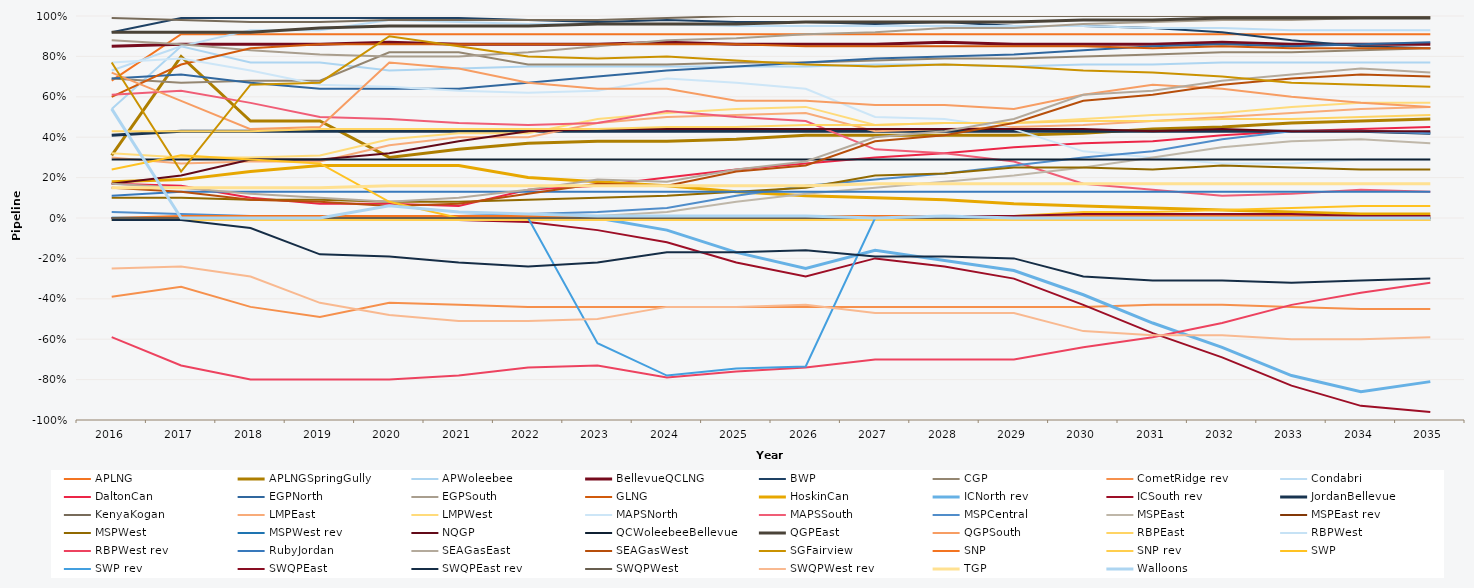
| Category | APLNG | APLNGSpringGully | APWoleebee | BellevueQCLNG | BWP | CGP | CometRidge rev | Condabri | DaltonCan | EGPNorth | EGPSouth | GLNG | HoskinCan | ICNorth rev | ICSouth rev | JordanBellevue | KenyaKogan | LMPEast | LMPWest | MAPSNorth | MAPSSouth | MSPCentral | MSPEast | MSPEast rev | MSPWest | MSPWest rev | NQGP | QCWoleebeeBellevue | QGPEast | QGPSouth | RBPEast | RBPWest | RBPWest rev | RubyJordan | SEAGasEast | SEAGasWest | SGFairview | SNP | SNP rev | SWP | SWP rev | SWQPEast | SWQPEast rev | SWQPWest | SWQPWest rev | TGP | Walloons |
|---|---|---|---|---|---|---|---|---|---|---|---|---|---|---|---|---|---|---|---|---|---|---|---|---|---|---|---|---|---|---|---|---|---|---|---|---|---|---|---|---|---|---|---|---|---|---|---|
| 2016.0 | 0.68 | 0.31 | 0.54 | 0.85 | 0.92 | 0.69 | -0.39 | 0.73 | 0.17 | 0.69 | 0.88 | 0.6 | 0.18 | 0 | 0 | 0.41 | 0.99 | 0.3 | 0.32 | 0.77 | 0.61 | 0.03 | 0 | 0 | 0.1 | 0 | 0.17 | 0.29 | 0.92 | 0.72 | 0.43 | 0 | -0.59 | 0.11 | 0.17 | 0.15 | 0.77 | 0 | -0.01 | 0.24 | 0 | 0 | -0.01 | 0 | -0.25 | 0.15 | 0.54 |
| 2017.0 | 0.91 | 0.8 | 0.85 | 0.86 | 0.99 | 0.67 | -0.34 | 0.85 | 0.16 | 0.71 | 0.86 | 0.76 | 0.19 | 0 | -0.01 | 0.43 | 0.98 | 0.27 | 0.3 | 0.79 | 0.63 | 0.02 | 0 | 0 | 0.1 | 0 | 0.21 | 0.29 | 0.92 | 0.58 | 0.43 | 0 | -0.73 | 0.13 | 0.15 | 0.13 | 0.23 | 0.01 | -0.01 | 0.31 | 0 | 0 | -0.01 | 0 | -0.24 | 0.15 | 0 |
| 2018.0 | 0.91 | 0.48 | 0.77 | 0.86 | 0.99 | 0.68 | -0.44 | 0.93 | 0.1 | 0.67 | 0.83 | 0.84 | 0.23 | 0 | -0.01 | 0.43 | 0.97 | 0.28 | 0.3 | 0.73 | 0.57 | 0.01 | 0 | 0 | 0.09 | 0 | 0.29 | 0.29 | 0.92 | 0.44 | 0.43 | 0 | -0.8 | 0.13 | 0.12 | 0.09 | 0.66 | 0.01 | -0.01 | 0.29 | 0 | 0 | -0.05 | 0 | -0.29 | 0.15 | 0 |
| 2019.0 | 0.91 | 0.48 | 0.77 | 0.86 | 0.99 | 0.68 | -0.49 | 0.93 | 0.07 | 0.64 | 0.81 | 0.86 | 0.26 | 0 | -0.01 | 0.43 | 0.97 | 0.28 | 0.31 | 0.66 | 0.5 | 0.01 | 0 | 0 | 0.09 | 0 | 0.29 | 0.29 | 0.94 | 0.45 | 0.44 | 0 | -0.8 | 0.13 | 0.1 | 0.08 | 0.67 | 0.01 | -0.01 | 0.27 | 0 | 0 | -0.18 | 0 | -0.42 | 0.15 | 0 |
| 2020.0 | 0.91 | 0.3 | 0.73 | 0.87 | 0.99 | 0.82 | -0.42 | 0.98 | 0.07 | 0.64 | 0.8 | 0.86 | 0.26 | 0 | -0.01 | 0.43 | 0.98 | 0.36 | 0.39 | 0.65 | 0.49 | 0.01 | 0 | 0 | 0.08 | 0 | 0.32 | 0.29 | 0.95 | 0.77 | 0.44 | 0 | -0.8 | 0.13 | 0.08 | 0.06 | 0.9 | 0.01 | -0.01 | 0.08 | 0 | 0 | -0.19 | 0 | -0.48 | 0.16 | 0.06 |
| 2021.0 | 0.91 | 0.34 | 0.74 | 0.86 | 0.99 | 0.82 | -0.43 | 0.97 | 0.06 | 0.64 | 0.8 | 0.86 | 0.26 | 0 | -0.01 | 0.43 | 0.98 | 0.4 | 0.42 | 0.63 | 0.47 | 0.01 | 0 | 0 | 0.08 | 0 | 0.38 | 0.29 | 0.95 | 0.74 | 0.44 | 0 | -0.78 | 0.13 | 0.1 | 0.07 | 0.85 | 0.01 | -0.01 | 0 | 0 | 0 | -0.22 | 0 | -0.51 | 0.16 | 0.03 |
| 2022.0 | 0.91 | 0.37 | 0.75 | 0.86 | 0.98 | 0.76 | -0.44 | 0.96 | 0.14 | 0.67 | 0.82 | 0.86 | 0.2 | 0 | -0.02 | 0.43 | 0.98 | 0.4 | 0.42 | 0.62 | 0.46 | 0.02 | 0 | 0 | 0.09 | 0 | 0.43 | 0.29 | 0.95 | 0.67 | 0.44 | 0 | -0.74 | 0.13 | 0.14 | 0.12 | 0.8 | 0.01 | -0.01 | 0 | 0 | 0 | -0.24 | 0 | -0.51 | 0.16 | 0.02 |
| 2023.0 | 0.91 | 0.38 | 0.75 | 0.86 | 0.97 | 0.76 | -0.44 | 0.96 | 0.16 | 0.7 | 0.85 | 0.86 | 0.18 | 0 | -0.06 | 0.43 | 0.98 | 0.47 | 0.49 | 0.63 | 0.47 | 0.03 | 0.01 | 0 | 0.1 | 0 | 0.44 | 0.29 | 0.96 | 0.64 | 0.44 | 0 | -0.73 | 0.13 | 0.19 | 0.17 | 0.79 | 0.01 | -0.01 | 0 | -0.62 | 0 | -0.22 | 0 | -0.5 | 0.16 | 0.01 |
| 2024.0 | 0.91 | 0.38 | 0.75 | 0.87 | 0.98 | 0.76 | -0.44 | 0.96 | 0.2 | 0.73 | 0.88 | 0.86 | 0.16 | -0.06 | -0.12 | 0.43 | 0.99 | 0.5 | 0.52 | 0.69 | 0.53 | 0.05 | 0.03 | 0 | 0.11 | 0 | 0.44 | 0.29 | 0.96 | 0.64 | 0.45 | 0 | -0.79 | 0.13 | 0.18 | 0.16 | 0.8 | 0.01 | -0.01 | 0 | -0.78 | 0 | -0.17 | 0 | -0.44 | 0.16 | 0.01 |
| 2025.0 | 0.91 | 0.39 | 0.75 | 0.86 | 0.97 | 0.77 | -0.44 | 0.95 | 0.24 | 0.75 | 0.89 | 0.86 | 0.13 | -0.17 | -0.22 | 0.43 | 1 | 0.51 | 0.54 | 0.67 | 0.5 | 0.11 | 0.08 | 0 | 0.13 | 0 | 0.44 | 0.29 | 0.96 | 0.58 | 0.45 | 0 | -0.76 | 0.13 | 0.24 | 0.23 | 0.78 | 0.01 | -0.01 | 0 | -0.745 | 0 | -0.17 | 0 | -0.44 | 0.16 | 0.01 |
| 2026.0 | 0.91 | 0.41 | 0.75 | 0.86 | 0.97 | 0.77 | -0.44 | 0.95 | 0.27 | 0.77 | 0.91 | 0.85 | 0.11 | -0.25 | -0.29 | 0.43 | 1 | 0.52 | 0.55 | 0.64 | 0.48 | 0.16 | 0.12 | 0 | 0.15 | 0 | 0.44 | 0.29 | 0.97 | 0.58 | 0.46 | 0 | -0.74 | 0.13 | 0.28 | 0.26 | 0.76 | 0.01 | -0.01 | 0 | -0.735 | 0 | -0.16 | 0 | -0.43 | 0.16 | 0.01 |
| 2027.0 | 0.91 | 0.41 | 0.76 | 0.86 | 0.96 | 0.78 | -0.44 | 0.95 | 0.3 | 0.79 | 0.92 | 0.85 | 0.1 | -0.16 | -0.2 | 0.43 | 1 | 0.43 | 0.46 | 0.5 | 0.34 | 0.19 | 0.15 | 0 | 0.21 | 0 | 0.44 | 0.29 | 0.97 | 0.56 | 0.46 | 0 | -0.7 | 0.13 | 0.4 | 0.38 | 0.75 | 0.01 | -0.01 | 0 | 0 | 0 | -0.19 | 0 | -0.47 | 0.17 | 0 |
| 2028.0 | 0.91 | 0.41 | 0.76 | 0.87 | 0.97 | 0.79 | -0.44 | 0.95 | 0.32 | 0.8 | 0.94 | 0.85 | 0.09 | -0.21 | -0.24 | 0.43 | 1 | 0.44 | 0.47 | 0.49 | 0.32 | 0.22 | 0.18 | 0 | 0.22 | 0 | 0.44 | 0.29 | 0.97 | 0.56 | 0.47 | 0 | -0.7 | 0.13 | 0.43 | 0.41 | 0.76 | 0.01 | -0.01 | 0 | 0 | 0.01 | -0.19 | 0 | -0.47 | 0.17 | 0.01 |
| 2029.0 | 0.91 | 0.41 | 0.75 | 0.86 | 0.95 | 0.79 | -0.44 | 0.95 | 0.35 | 0.81 | 0.94 | 0.85 | 0.07 | -0.26 | -0.3 | 0.43 | 1 | 0.45 | 0.47 | 0.44 | 0.28 | 0.26 | 0.21 | 0 | 0.25 | 0 | 0.44 | 0.29 | 0.97 | 0.54 | 0.47 | 0 | -0.7 | 0.13 | 0.49 | 0.47 | 0.75 | 0.01 | -0.01 | 0.01 | 0 | 0.01 | -0.2 | 0 | -0.47 | 0.17 | 0 |
| 2030.0 | 0.91 | 0.42 | 0.76 | 0.86 | 0.95 | 0.8 | -0.44 | 0.95 | 0.37 | 0.83 | 0.96 | 0.85 | 0.06 | -0.38 | -0.43 | 0.43 | 1 | 0.46 | 0.49 | 0.33 | 0.17 | 0.3 | 0.25 | 0 | 0.25 | 0 | 0.44 | 0.29 | 0.98 | 0.61 | 0.48 | 0 | -0.64 | 0.13 | 0.61 | 0.58 | 0.73 | 0.01 | -0.01 | 0.03 | 0 | 0.02 | -0.29 | 0 | -0.56 | 0.17 | 0 |
| 2031.0 | 0.91 | 0.44 | 0.76 | 0.86 | 0.94 | 0.81 | -0.43 | 0.94 | 0.38 | 0.85 | 0.97 | 0.84 | 0.05 | -0.52 | -0.57 | 0.43 | 1 | 0.48 | 0.51 | 0.3 | 0.14 | 0.33 | 0.3 | -0.01 | 0.24 | 0 | 0.43 | 0.29 | 0.98 | 0.66 | 0.48 | 0 | -0.59 | 0.13 | 0.63 | 0.61 | 0.72 | 0.01 | -0.01 | 0.03 | 0 | 0.02 | -0.31 | 0 | -0.58 | 0.17 | 0 |
| 2032.0 | 0.91 | 0.45 | 0.77 | 0.87 | 0.92 | 0.82 | -0.43 | 0.94 | 0.41 | 0.86 | 0.98 | 0.85 | 0.04 | -0.64 | -0.69 | 0.43 | 1 | 0.5 | 0.52 | 0.27 | 0.11 | 0.39 | 0.35 | -0.01 | 0.26 | 0 | 0.44 | 0.29 | 0.99 | 0.64 | 0.49 | 0 | -0.52 | 0.13 | 0.68 | 0.66 | 0.7 | 0.01 | -0.01 | 0.04 | 0 | 0.02 | -0.31 | 0 | -0.58 | 0.17 | 0 |
| 2033.0 | 0.91 | 0.47 | 0.77 | 0.86 | 0.88 | 0.82 | -0.44 | 0.93 | 0.43 | 0.85 | 0.98 | 0.84 | 0.03 | -0.78 | -0.83 | 0.43 | 1 | 0.52 | 0.55 | 0.27 | 0.12 | 0.43 | 0.38 | 0 | 0.25 | 0 | 0.43 | 0.29 | 0.99 | 0.6 | 0.49 | 0 | -0.43 | 0.13 | 0.71 | 0.69 | 0.67 | 0.01 | -0.01 | 0.05 | 0 | 0.02 | -0.32 | 0 | -0.6 | 0.17 | 0 |
| 2034.0 | 0.91 | 0.48 | 0.77 | 0.86 | 0.85 | 0.83 | -0.45 | 0.93 | 0.44 | 0.86 | 0.99 | 0.84 | 0.02 | -0.86 | -0.93 | 0.43 | 1 | 0.54 | 0.57 | 0.29 | 0.14 | 0.43 | 0.39 | 0 | 0.24 | 0 | 0.43 | 0.29 | 0.99 | 0.57 | 0.5 | 0 | -0.37 | 0.13 | 0.74 | 0.71 | 0.66 | 0.01 | -0.01 | 0.06 | 0 | 0.01 | -0.31 | 0 | -0.6 | 0.17 | 0 |
| 2035.0 | 0.91 | 0.49 | 0.77 | 0.86 | 0.84 | 0.84 | -0.45 | 0.93 | 0.45 | 0.87 | 0.99 | 0.84 | 0.02 | -0.81 | -0.96 | 0.42 | 1 | 0.55 | 0.57 | 0.29 | 0.13 | 0.42 | 0.37 | 0 | 0.24 | -0.01 | 0.43 | 0.29 | 0.99 | 0.55 | 0.51 | 0 | -0.32 | 0.13 | 0.72 | 0.7 | 0.65 | 0.01 | -0.01 | 0.06 | 0 | 0.01 | -0.3 | 0 | -0.59 | 0.17 | 0 |